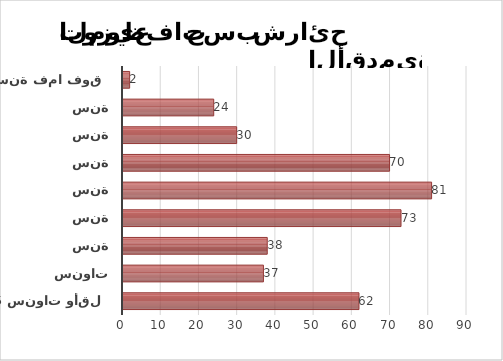
| Category | Series 1 |
|---|---|
| 5 سنوات وأقل | 62 |
| ما بين 6 و10 سنوات | 37 |
| ما بين 11 و 15 سنة | 38 |
| ما بين 16 و20 سنة | 73 |
| ما بين 21 و25 سنة | 81 |
| ما بين 26 و30 سنة | 70 |
| ما بين 31 و35 سنة | 30 |
| ما بين 36 و40 سنة | 24 |
| 41 سنة فما فوق | 2 |